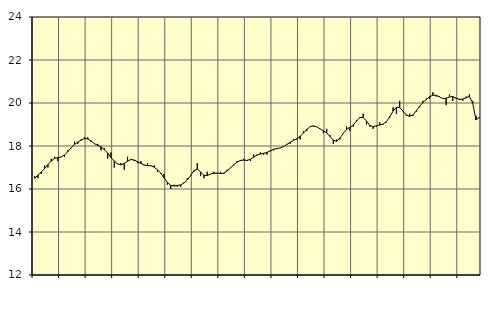
| Category | Piggar | Vård och omsorg, SNI 86-88 |
|---|---|---|
| nan | 16.6 | 16.5 |
| 87.0 | 16.5 | 16.64 |
| 87.0 | 16.7 | 16.79 |
| 87.0 | 17.1 | 16.95 |
| nan | 17 | 17.14 |
| 88.0 | 17.4 | 17.3 |
| 88.0 | 17.5 | 17.42 |
| 88.0 | 17.3 | 17.46 |
| nan | 17.5 | 17.49 |
| 89.0 | 17.5 | 17.58 |
| 89.0 | 17.8 | 17.74 |
| 89.0 | 17.9 | 17.92 |
| nan | 18.2 | 18.07 |
| 90.0 | 18.1 | 18.18 |
| 90.0 | 18.3 | 18.27 |
| 90.0 | 18.4 | 18.35 |
| nan | 18.4 | 18.33 |
| 91.0 | 18.2 | 18.24 |
| 91.0 | 18.1 | 18.11 |
| 91.0 | 18.1 | 18.03 |
| nan | 17.8 | 17.96 |
| 92.0 | 17.9 | 17.83 |
| 92.0 | 17.4 | 17.67 |
| 92.0 | 17.7 | 17.46 |
| nan | 17 | 17.3 |
| 93.0 | 17.2 | 17.17 |
| 93.0 | 17.2 | 17.12 |
| 93.0 | 16.9 | 17.19 |
| nan | 17.5 | 17.29 |
| 94.0 | 17.4 | 17.37 |
| 94.0 | 17.3 | 17.35 |
| 94.0 | 17.2 | 17.27 |
| nan | 17.3 | 17.19 |
| 95.0 | 17.1 | 17.12 |
| 95.0 | 17.2 | 17.09 |
| 95.0 | 17.1 | 17.08 |
| nan | 17.1 | 17.02 |
| 96.0 | 16.8 | 16.89 |
| 96.0 | 16.7 | 16.74 |
| 96.0 | 16.7 | 16.52 |
| nan | 16.2 | 16.3 |
| 97.0 | 16 | 16.17 |
| 97.0 | 16.2 | 16.14 |
| 97.0 | 16.1 | 16.17 |
| nan | 16.1 | 16.19 |
| 98.0 | 16.3 | 16.28 |
| 98.0 | 16.5 | 16.42 |
| 98.0 | 16.6 | 16.63 |
| nan | 16.8 | 16.86 |
| 99.0 | 17.2 | 16.92 |
| 99.0 | 16.6 | 16.79 |
| 99.0 | 16.5 | 16.64 |
| nan | 16.8 | 16.62 |
| 0.0 | 16.7 | 16.7 |
| 0.0 | 16.8 | 16.73 |
| 0.0 | 16.7 | 16.74 |
| nan | 16.8 | 16.72 |
| 1.0 | 16.7 | 16.74 |
| 1.0 | 16.9 | 16.84 |
| 1.0 | 17 | 16.98 |
| nan | 17.1 | 17.13 |
| 2.0 | 17.3 | 17.25 |
| 2.0 | 17.3 | 17.33 |
| 2.0 | 17.4 | 17.34 |
| nan | 17.3 | 17.33 |
| 3.0 | 17.3 | 17.38 |
| 3.0 | 17.6 | 17.48 |
| 3.0 | 17.6 | 17.58 |
| nan | 17.7 | 17.63 |
| 4.0 | 17.6 | 17.66 |
| 4.0 | 17.6 | 17.7 |
| 4.0 | 17.8 | 17.77 |
| nan | 17.8 | 17.85 |
| 5.0 | 17.9 | 17.88 |
| 5.0 | 17.9 | 17.91 |
| 5.0 | 18 | 17.97 |
| nan | 18.1 | 18.07 |
| 6.0 | 18.1 | 18.17 |
| 6.0 | 18.3 | 18.26 |
| 6.0 | 18.3 | 18.34 |
| nan | 18.3 | 18.45 |
| 7.0 | 18.7 | 18.6 |
| 7.0 | 18.7 | 18.77 |
| 7.0 | 18.9 | 18.9 |
| nan | 18.9 | 18.94 |
| 8.0 | 18.9 | 18.89 |
| 8.0 | 18.8 | 18.8 |
| 8.0 | 18.6 | 18.71 |
| nan | 18.8 | 18.61 |
| 9.0 | 18.5 | 18.44 |
| 9.0 | 18.1 | 18.27 |
| 9.0 | 18.3 | 18.22 |
| nan | 18.3 | 18.37 |
| 10.0 | 18.6 | 18.59 |
| 10.0 | 18.9 | 18.77 |
| 10.0 | 18.7 | 18.87 |
| nan | 18.9 | 18.97 |
| 11.0 | 19.2 | 19.16 |
| 11.0 | 19.3 | 19.33 |
| 11.0 | 19.5 | 19.33 |
| nan | 19 | 19.16 |
| 12.0 | 18.9 | 18.96 |
| 12.0 | 18.8 | 18.9 |
| 12.0 | 18.9 | 18.94 |
| nan | 19.1 | 18.98 |
| 13.0 | 19 | 19.02 |
| 13.0 | 19.1 | 19.13 |
| 13.0 | 19.3 | 19.36 |
| nan | 19.8 | 19.62 |
| 14.0 | 19.5 | 19.8 |
| 14.0 | 20.1 | 19.79 |
| 14.0 | 19.6 | 19.62 |
| nan | 19.4 | 19.44 |
| 15.0 | 19.5 | 19.38 |
| 15.0 | 19.4 | 19.45 |
| 15.0 | 19.6 | 19.63 |
| nan | 19.8 | 19.85 |
| 16.0 | 20.1 | 20.02 |
| 16.0 | 20.2 | 20.16 |
| 16.0 | 20.2 | 20.29 |
| nan | 20.5 | 20.36 |
| 17.0 | 20.3 | 20.36 |
| 17.0 | 20.3 | 20.28 |
| 17.0 | 20.2 | 20.21 |
| nan | 19.9 | 20.22 |
| 18.0 | 20.4 | 20.28 |
| 18.0 | 20.1 | 20.3 |
| 18.0 | 20.2 | 20.23 |
| nan | 20.2 | 20.16 |
| 19.0 | 20.1 | 20.18 |
| 19.0 | 20.3 | 20.24 |
| 19.0 | 20.4 | 20.31 |
| nan | 20.1 | 19.99 |
| 20.0 | 19.4 | 19.21 |
| 20.0 | 19.3 | 19.33 |